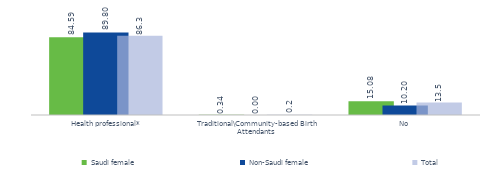
| Category | Saudi female  | Non-Saudi female | Total |
|---|---|---|---|
| Health professional* | 84.586 | 89.797 | 86.273 |
| Traditional\Community-based Birth Attendants  | 0.336 | 0 | 0.227 |
| No | 15.078 | 10.203 | 13.499 |